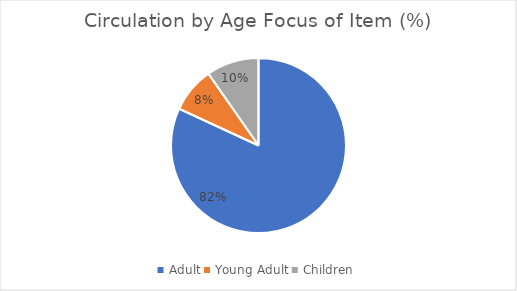
| Category | % |
|---|---|
| Adult | 0.819 |
| Young Adult | 0.084 |
| Children | 0.097 |